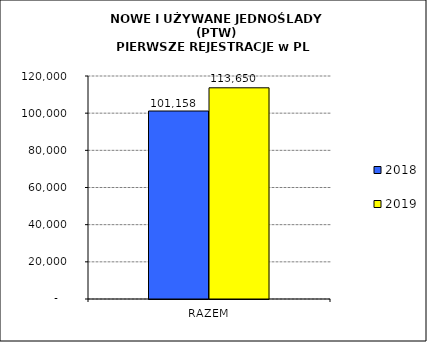
| Category | 2018 | 2019 |
|---|---|---|
| RAZEM | 101158 | 113650 |